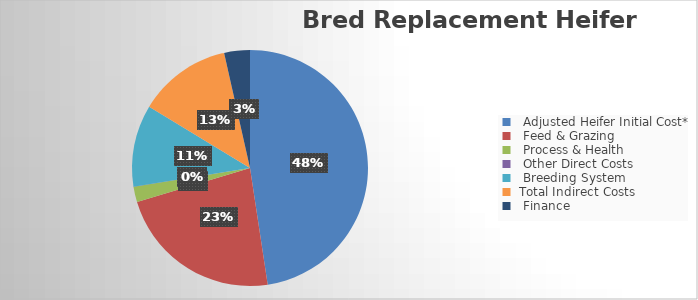
| Category | Series 0 |
|---|---|
|   Adjusted Heifer Initial Cost* | 645.856 |
|   Feed & Grazing  | 308.623 |
|   Process & Health | 28.935 |
|   Other Direct Costs | 0 |
|   Breeding System  | 152.15 |
|  Total Indirect Costs | 173.514 |
|   Finance | 47.782 |